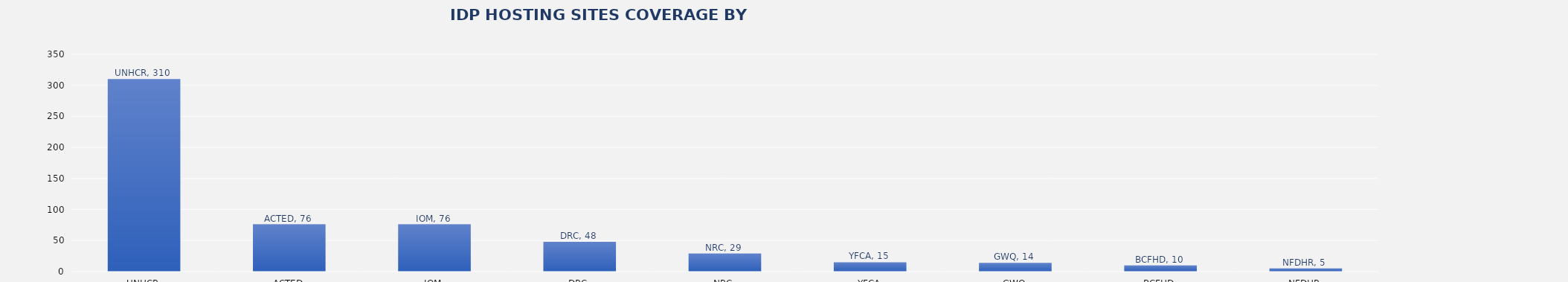
| Category | Total |
|---|---|
| UNHCR | 310 |
| ACTED | 76 |
| IOM | 76 |
| DRC | 48 |
| NRC | 29 |
| YFCA | 15 |
| GWQ | 14 |
| BCFHD | 10 |
| NFDHR | 5 |